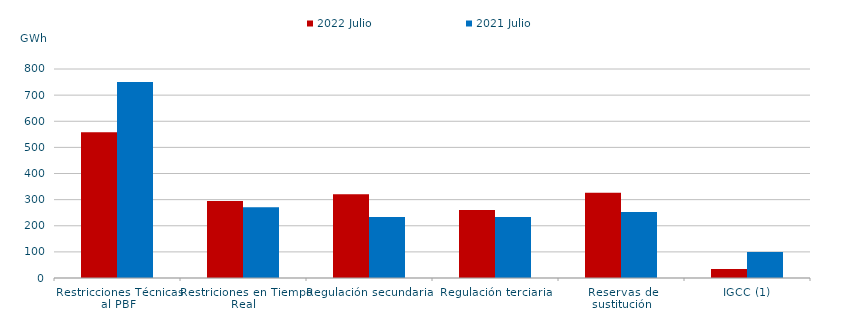
| Category | 2022 Julio | 2021 Julio |
|---|---|---|
| Restricciones Técnicas al PBF | 557.885 | 750.123 |
| Restriciones en Tiempo Real | 294.549 | 270.367 |
| Regulación secundaria | 320.606 | 233.317 |
| Regulación terciaria | 259.865 | 233.666 |
| Reservas de sustitución | 326.464 | 252.858 |
| IGCC (1) | 34.133 | 99.93 |